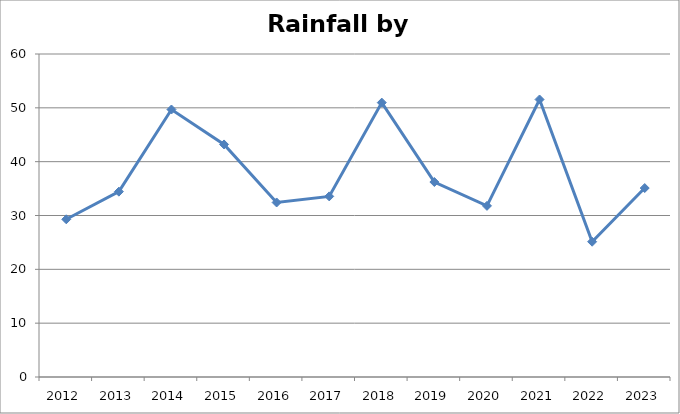
| Category | Year |
|---|---|
| 2012.0 | 29.295 |
| 2013.0 | 34.43 |
| 2014.0 | 49.69 |
| 2015.0 | 43.2 |
| 2016.0 | 32.42 |
| 2017.0 | 33.55 |
| 2018.0 | 50.97 |
| 2019.0 | 36.22 |
| 2020.0 | 31.79 |
| 2021.0 | 51.55 |
| 2022.0 | 25.13 |
| 2023.0 | 35.1 |